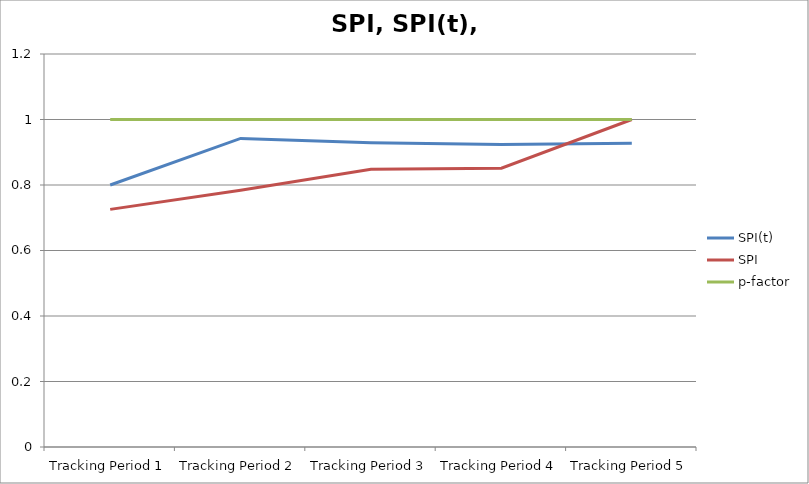
| Category | SPI(t) | SPI | p-factor |
|---|---|---|---|
| Tracking Period 1 | 0.8 | 0.726 | 1 |
| Tracking Period 2 | 0.942 | 0.784 | 1 |
| Tracking Period 3 | 0.929 | 0.848 | 1 |
| Tracking Period 4 | 0.924 | 0.851 | 1 |
| Tracking Period 5 | 0.927 | 1 | 1 |